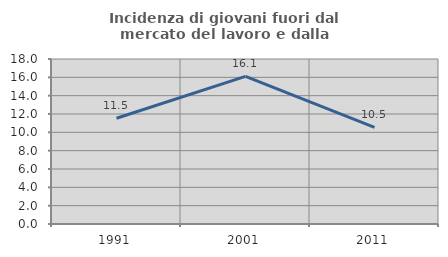
| Category | Incidenza di giovani fuori dal mercato del lavoro e dalla formazione  |
|---|---|
| 1991.0 | 11.535 |
| 2001.0 | 16.11 |
| 2011.0 | 10.534 |